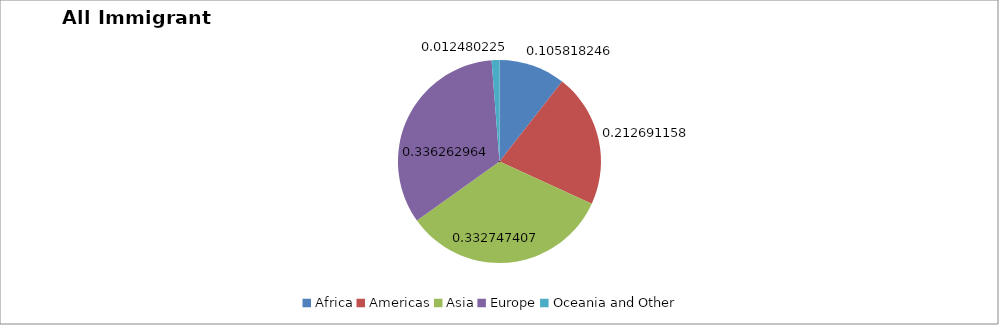
| Category | Series 0 |
|---|---|
| Africa | 0.106 |
| Americas | 0.213 |
| Asia | 0.333 |
| Europe | 0.336 |
| Oceania and Other | 0.012 |